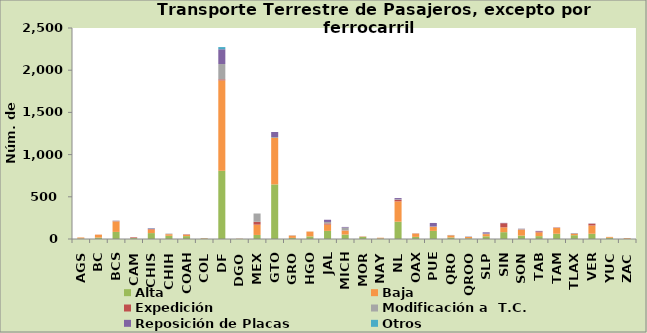
| Category | Alta                                         | Baja | Expedición | Modificación a  T.C. | Reposición de Placas | Otros |
|---|---|---|---|---|---|---|
| AGS | 6 | 12 | 0 | 0 | 0 | 0 |
| BC | 17 | 34 | 1 | 0 | 0 | 0 |
| BCS | 84 | 124 | 3 | 5 | 2 | 0 |
| CAM | 11 | 2 | 7 | 0 | 0 | 0 |
| CHIS | 70 | 43 | 6 | 2 | 6 | 2 |
| CHIH | 38 | 19 | 0 | 7 | 0 | 0 |
| COAH | 34 | 17 | 3 | 0 | 2 | 0 |
| COL | 5 | 4 | 1 | 0 | 0 | 0 |
| DF | 808 | 1071 | 13 | 181 | 175 | 26 |
| DGO | 1 | 3 | 0 | 0 | 0 | 0 |
| MEX | 48 | 122 | 34 | 98 | 0 | 0 |
| GTO | 647 | 550 | 0 | 11 | 60 | 0 |
| GRO | 13 | 27 | 1 | 3 | 0 | 0 |
| HGO | 31 | 57 | 0 | 1 | 0 | 0 |
| JAL | 96 | 75 | 14 | 17 | 26 | 0 |
| MICH | 53 | 47 | 2 | 33 | 8 | 0 |
| MOR | 25 | 3 | 2 | 0 | 0 | 0 |
| NAY | 6 | 9 | 0 | 0 | 0 | 0 |
| NL | 205 | 241 | 18 | 6 | 15 | 0 |
| OAX | 25 | 40 | 0 | 0 | 2 | 0 |
| PUE | 96 | 49 | 0 | 3 | 42 | 0 |
| QRO | 18 | 25 | 1 | 4 | 0 | 0 |
| QROO | 8 | 16 | 0 | 4 | 2 | 0 |
| SLP | 32 | 26 | 0 | 6 | 15 | 0 |
| SIN | 81 | 57 | 49 | 0 | 4 | 0 |
| SON | 40 | 70 | 4 | 7 | 2 | 0 |
| TAB | 34 | 44 | 12 | 0 | 6 | 0 |
| TAM | 62 | 70 | 3 | 0 | 2 | 0 |
| TLAX | 45 | 18 | 0 | 6 | 2 | 0 |
| VER | 62 | 98 | 21 | 1 | 2 | 0 |
| YUC | 15 | 10 | 0 | 0 | 0 | 0 |
| ZAC | 1 | 9 | 0 | 0 | 0 | 0 |